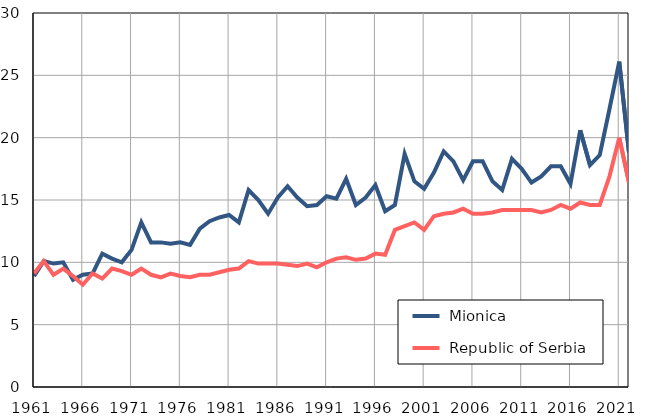
| Category |  Mionica |  Republic of Serbia |
|---|---|---|
| 1961.0 | 8.9 | 9.1 |
| 1962.0 | 10.1 | 10.1 |
| 1963.0 | 9.9 | 9 |
| 1964.0 | 10 | 9.5 |
| 1965.0 | 8.6 | 8.9 |
| 1966.0 | 9 | 8.2 |
| 1967.0 | 9.1 | 9.1 |
| 1968.0 | 10.7 | 8.7 |
| 1969.0 | 10.3 | 9.5 |
| 1970.0 | 10 | 9.3 |
| 1971.0 | 11 | 9 |
| 1972.0 | 13.2 | 9.5 |
| 1973.0 | 11.6 | 9 |
| 1974.0 | 11.6 | 8.8 |
| 1975.0 | 11.5 | 9.1 |
| 1976.0 | 11.6 | 8.9 |
| 1977.0 | 11.4 | 8.8 |
| 1978.0 | 12.7 | 9 |
| 1979.0 | 13.3 | 9 |
| 1980.0 | 13.6 | 9.2 |
| 1981.0 | 13.8 | 9.4 |
| 1982.0 | 13.2 | 9.5 |
| 1983.0 | 15.8 | 10.1 |
| 1984.0 | 15 | 9.9 |
| 1985.0 | 13.9 | 9.9 |
| 1986.0 | 15.2 | 9.9 |
| 1987.0 | 16.1 | 9.8 |
| 1988.0 | 15.2 | 9.7 |
| 1989.0 | 14.5 | 9.9 |
| 1990.0 | 14.6 | 9.6 |
| 1991.0 | 15.3 | 10 |
| 1992.0 | 15.1 | 10.3 |
| 1993.0 | 16.7 | 10.4 |
| 1994.0 | 14.6 | 10.2 |
| 1995.0 | 15.2 | 10.3 |
| 1996.0 | 16.2 | 10.7 |
| 1997.0 | 14.1 | 10.6 |
| 1998.0 | 14.6 | 12.6 |
| 1999.0 | 18.7 | 12.9 |
| 2000.0 | 16.5 | 13.2 |
| 2001.0 | 15.9 | 12.6 |
| 2002.0 | 17.2 | 13.7 |
| 2003.0 | 18.9 | 13.9 |
| 2004.0 | 18.1 | 14 |
| 2005.0 | 16.6 | 14.3 |
| 2006.0 | 18.1 | 13.9 |
| 2007.0 | 18.1 | 13.9 |
| 2008.0 | 16.5 | 14 |
| 2009.0 | 15.8 | 14.2 |
| 2010.0 | 18.3 | 14.2 |
| 2011.0 | 17.5 | 14.2 |
| 2012.0 | 16.4 | 14.2 |
| 2013.0 | 16.9 | 14 |
| 2014.0 | 17.7 | 14.2 |
| 2015.0 | 17.7 | 14.6 |
| 2016.0 | 16.3 | 14.3 |
| 2017.0 | 20.6 | 14.8 |
| 2018.0 | 17.8 | 14.6 |
| 2019.0 | 18.6 | 14.6 |
| 2020.0 | 22.3 | 16.9 |
| 2021.0 | 26.1 | 20 |
| 2022.0 | 18.8 | 16.4 |